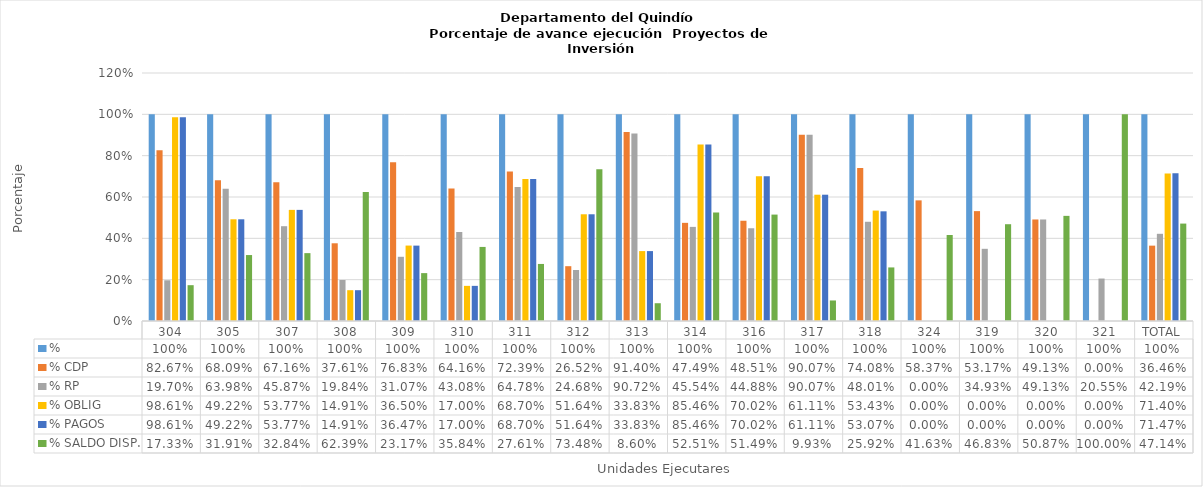
| Category | % | % CDP | % RP | % OBLIG | % PAGOS | % SALDO DISP. |
|---|---|---|---|---|---|---|
| 304 | 1 | 0.827 | 0.197 | 0.986 | 0.986 | 0.173 |
| 305 | 1 | 0.681 | 0.64 | 0.492 | 0.492 | 0.319 |
| 307 | 1 | 0.672 | 0.459 | 0.538 | 0.538 | 0.328 |
| 308 | 1 | 0.376 | 0.198 | 0.149 | 0.149 | 0.624 |
| 309 | 1 | 0.768 | 0.311 | 0.365 | 0.365 | 0.232 |
| 310 | 1 | 0.642 | 0.431 | 0.17 | 0.17 | 0.358 |
| 311 | 1 | 0.724 | 0.648 | 0.687 | 0.687 | 0.276 |
| 312 | 1 | 0.265 | 0.247 | 0.516 | 0.516 | 0.735 |
| 313 | 1 | 0.914 | 0.907 | 0.338 | 0.338 | 0.086 |
| 314 | 1 | 0.475 | 0.455 | 0.855 | 0.855 | 0.525 |
| 316 | 1 | 0.485 | 0.449 | 0.7 | 0.7 | 0.515 |
| 317 | 1 | 0.901 | 0.901 | 0.611 | 0.611 | 0.099 |
| 318 | 1 | 0.741 | 0.48 | 0.534 | 0.531 | 0.259 |
| 324 | 1 | 0.584 | 0 | 0 | 0 | 0.416 |
| 319 | 1 | 0.532 | 0.349 | 0 | 0 | 0.468 |
| 320 | 1 | 0.491 | 0.491 | 0 | 0 | 0.509 |
| 321 | 1 | 0 | 0.205 | 0 | 0 | 1 |
| TOTAL | 1 | 0.365 | 0.422 | 0.714 | 0.715 | 0.471 |